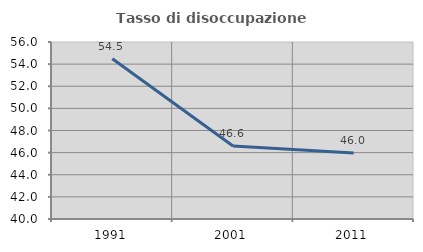
| Category | Tasso di disoccupazione giovanile  |
|---|---|
| 1991.0 | 54.487 |
| 2001.0 | 46.602 |
| 2011.0 | 45.977 |